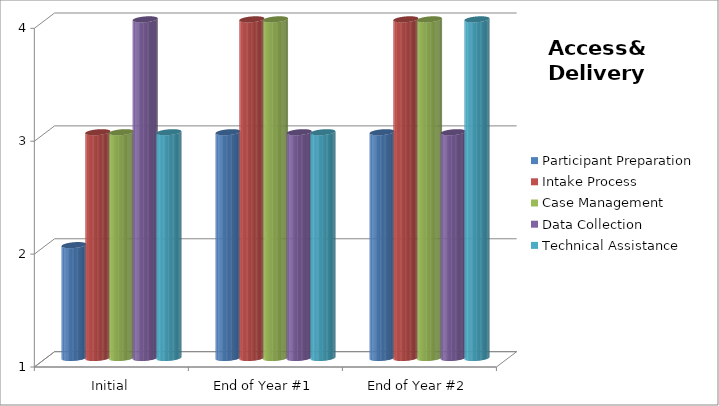
| Category | Participant Preparation  | Intake Process  | Case Management  | Data Collection  | Technical Assistance  |
|---|---|---|---|---|---|
| Initial | 2 | 3 | 3 | 4 | 3 |
| End of Year #1 | 3 | 4 | 4 | 3 | 3 |
| End of Year #2 | 3 | 4 | 4 | 3 | 4 |